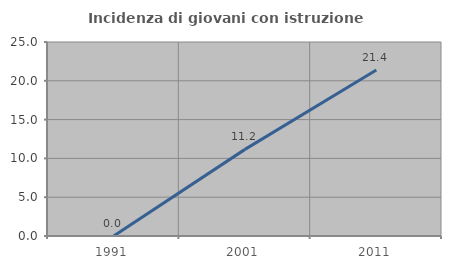
| Category | Incidenza di giovani con istruzione universitaria |
|---|---|
| 1991.0 | 0 |
| 2001.0 | 11.163 |
| 2011.0 | 21.387 |